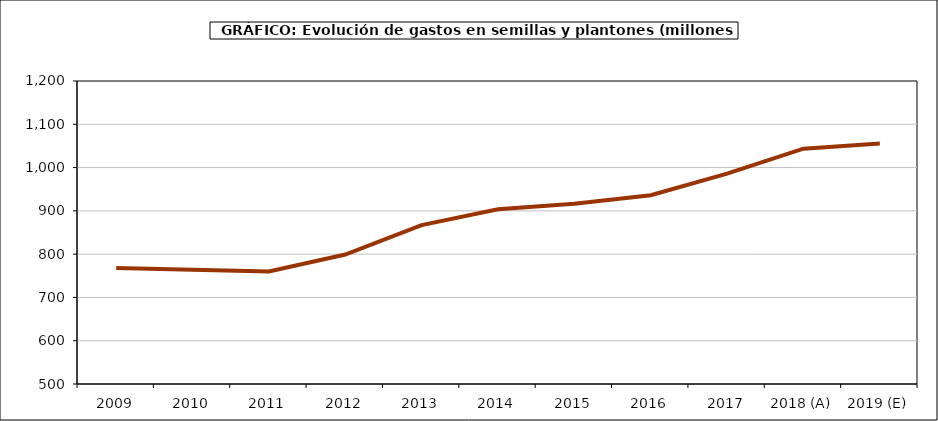
| Category | Semillas |
|---|---|
| 2009 | 768.186 |
| 2010 | 763.963 |
| 2011 | 759.736 |
| 2012 | 799.053 |
| 2013 | 867.097 |
| 2014 | 903.589 |
| 2015 | 916.393 |
| 2016 | 936.239 |
| 2017 | 986.016 |
| 2018 (A) | 1043.565 |
| 2019 (E) | 1055.873 |